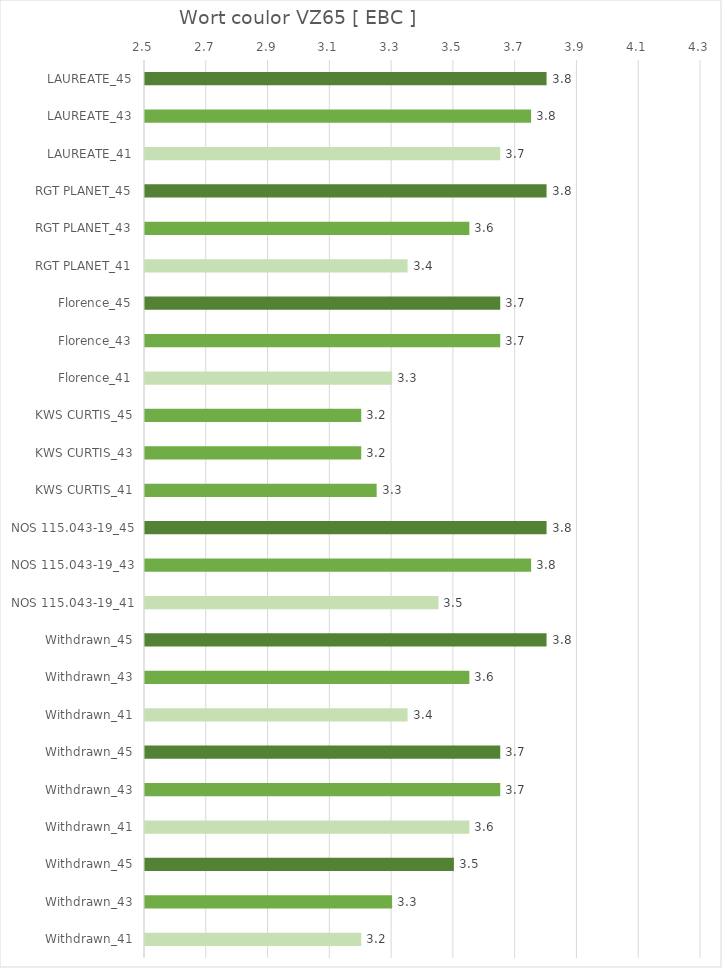
| Category |   Wort coulor VZ65 [ EBC ] |
|---|---|
| LAUREATE_45 | 3.8 |
| LAUREATE_43 | 3.75 |
| LAUREATE_41 | 3.65 |
| RGT PLANET_45 | 3.8 |
| RGT PLANET_43 | 3.55 |
| RGT PLANET_41 | 3.35 |
| Florence_45 | 3.65 |
| Florence_43 | 3.65 |
| Florence_41 | 3.3 |
| KWS CURTIS_45 | 3.2 |
| KWS CURTIS_43 | 3.2 |
| KWS CURTIS_41 | 3.25 |
| NOS 115.043-19_45 | 3.8 |
| NOS 115.043-19_43 | 3.75 |
| NOS 115.043-19_41 | 3.45 |
| Withdrawn_45 | 3.8 |
| Withdrawn_43 | 3.55 |
| Withdrawn_41 | 3.35 |
| Withdrawn_45 | 3.65 |
| Withdrawn_43 | 3.65 |
| Withdrawn_41 | 3.55 |
| Withdrawn_45 | 3.5 |
| Withdrawn_43 | 3.3 |
| Withdrawn_41 | 3.2 |